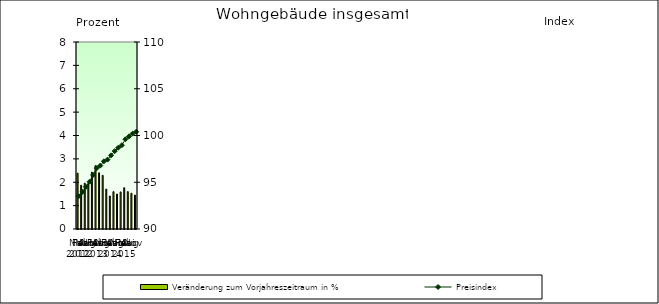
| Category | Veränderung zum Vorjahreszeitraum in % |
|---|---|
| 0 | 2.388 |
| 1 | 1.872 |
| 2 | 1.961 |
| 3 | 1.949 |
| 4 | 2.43 |
| 5 | 2.708 |
| 6 | 2.404 |
| 7 | 2.294 |
| 8 | 1.708 |
| 9 | 1.412 |
| 10 | 1.596 |
| 11 | 1.495 |
| 12 | 1.586 |
| 13 | 1.764 |
| 14 | 1.599 |
| 15 | 1.529 |
| 16 | 1.451 |